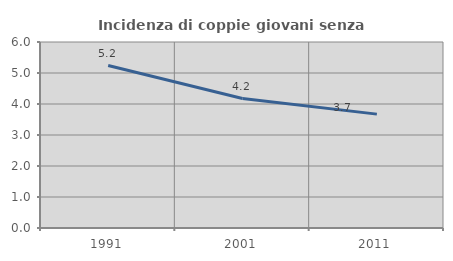
| Category | Incidenza di coppie giovani senza figli |
|---|---|
| 1991.0 | 5.24 |
| 2001.0 | 4.175 |
| 2011.0 | 3.673 |